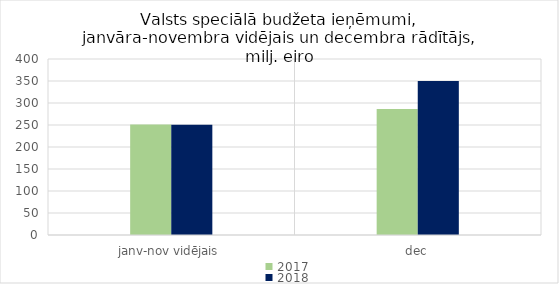
| Category | 2017 | 2018 |
|---|---|---|
| janv-nov vidējais | 251292.462 | 250681.659 |
| dec | 286098.933 | 350058.457 |